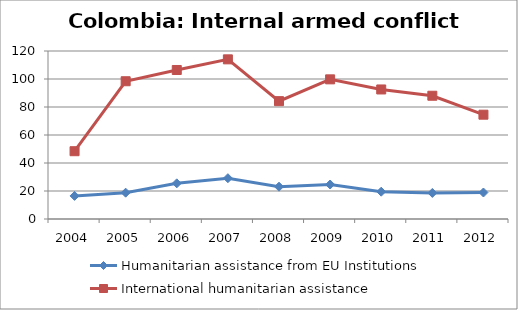
| Category | Humanitarian assistance from EU Institutions | International humanitarian assistance |
|---|---|---|
| 2004.0 | 16.49 | 48.416 |
| 2005.0 | 18.8 | 98.395 |
| 2006.0 | 25.47 | 106.436 |
| 2007.0 | 29.15 | 114.037 |
| 2008.0 | 23.07 | 84.179 |
| 2009.0 | 24.64 | 99.743 |
| 2010.0 | 19.5 | 92.525 |
| 2011.0 | 18.62 | 88.041 |
| 2012.0 | 18.92 | 74.507 |